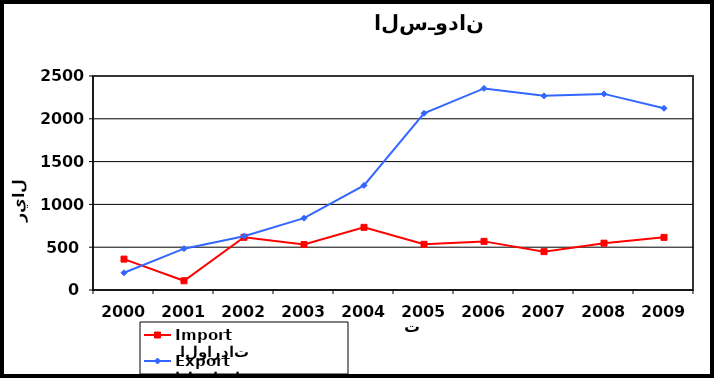
| Category |  الواردات           Import | الصادرات          Export |
|---|---|---|
| 2000.0 | 361 | 201 |
| 2001.0 | 108 | 483 |
| 2002.0 | 616 | 628 |
| 2003.0 | 531 | 839 |
| 2004.0 | 732 | 1222 |
| 2005.0 | 534 | 2064 |
| 2006.0 | 568 | 2355 |
| 2007.0 | 448 | 2268 |
| 2008.0 | 547 | 2291 |
| 2009.0 | 615 | 2123 |